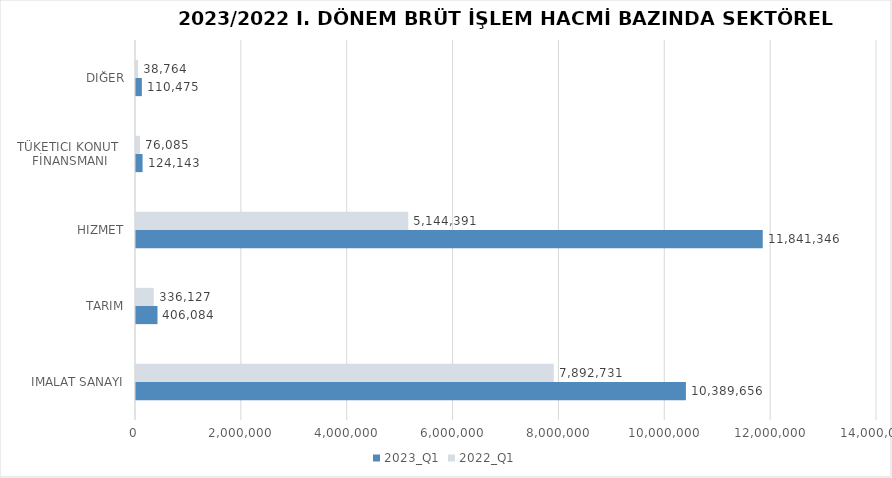
| Category | 2023_Q1 | 2022_Q1 |
|---|---|---|
| İMALAT SANAYİ | 10389655.7 | 7892731 |
| TARIM | 406084.149 | 336127 |
| HİZMET | 11841346.272 | 5144391 |
| TÜKETİCİ KONUT 
FİNANSMANI | 124143 | 76085 |
| DİĞER | 110475 | 38764 |